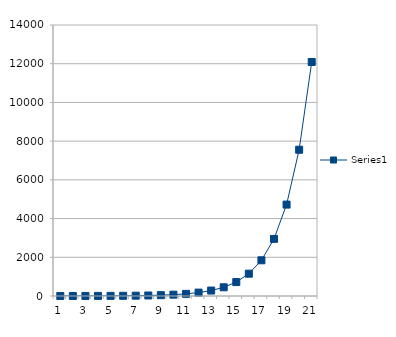
| Category | Series 0 |
|---|---|
| 0 | 1 |
| 1 | 1.6 |
| 2 | 2.56 |
| 3 | 4.096 |
| 4 | 6.554 |
| 5 | 10.486 |
| 6 | 16.777 |
| 7 | 26.844 |
| 8 | 42.95 |
| 9 | 68.719 |
| 10 | 109.951 |
| 11 | 175.922 |
| 12 | 281.475 |
| 13 | 450.36 |
| 14 | 720.576 |
| 15 | 1152.922 |
| 16 | 1844.674 |
| 17 | 2951.479 |
| 18 | 4722.366 |
| 19 | 7555.786 |
| 20 | 12089.258 |